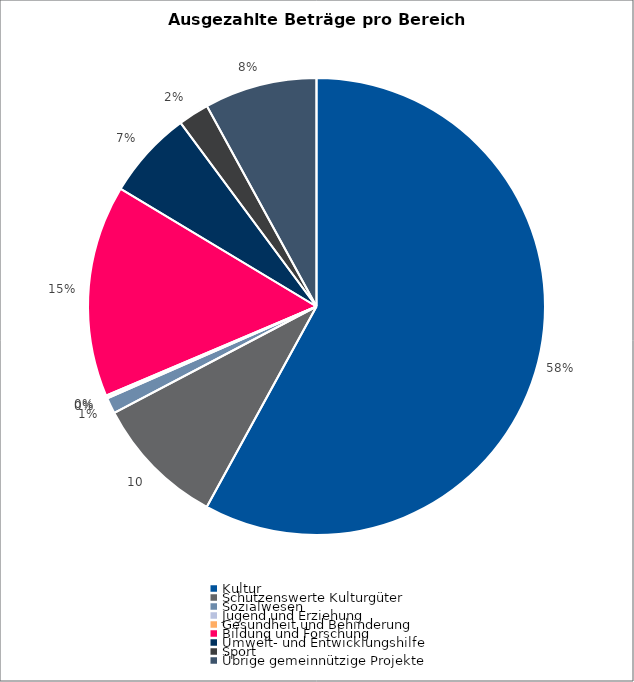
| Category | Series 0 |
|---|---|
| Kultur | 66151531 |
| Schützenswerte Kulturgüter | 10630350 |
| Sozialwesen | 1284583 |
| Jugend und Erziehung | 61884 |
| Gesundheit und Behinderung | 175843 |
| Bildung und Forschung | 17105751 |
| Umwelt- und Entwicklungshilfe | 7127354 |
| Sport | 2483500 |
| Übrige gemeinnützige Projekte | 9087322 |